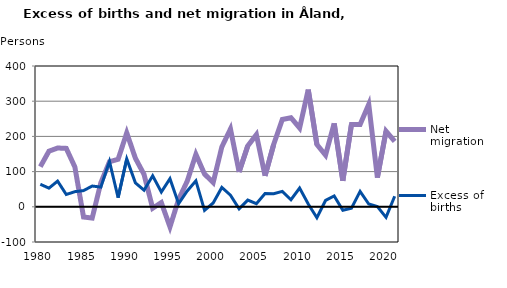
| Category | Net migration | Excess of births |
|---|---|---|
| 1980.0 | 114 | 64 |
| 1981.0 | 158 | 53 |
| 1982.0 | 167 | 73 |
| 1983.0 | 166 | 35 |
| 1984.0 | 113 | 43 |
| 1985.0 | -29 | 46 |
| 1986.0 | -32 | 59 |
| 1987.0 | 68 | 56 |
| 1988.0 | 128 | 129 |
| 1989.0 | 135 | 26 |
| 1990.0 | 210 | 136 |
| 1991.0 | 138 | 68 |
| 1992.0 | 92 | 47 |
| 1993.0 | -4 | 88 |
| 1994.0 | 12 | 42 |
| 1995.0 | -57 | 80 |
| 1996.0 | 21 | 9 |
| 1997.0 | 73 | 45 |
| 1998.0 | 149 | 74 |
| 1999.0 | 93 | -10 |
| 2000.0 | 69 | 11 |
| 2001.0 | 170 | 55 |
| 2002.0 | 221 | 33 |
| 2003.0 | 99 | -6 |
| 2004.0 | 173 | 19 |
| 2005.0 | 205 | 9 |
| 2006.0 | 88 | 38 |
| 2007.0 | 177 | 37 |
| 2008.0 | 248 | 44 |
| 2009.0 | 253 | 20 |
| 2010.0 | 224 | 53 |
| 2011.0 | 333 | 8 |
| 2012.0 | 177 | -31 |
| 2013.0 | 147 | 18 |
| 2014.0 | 237 | 31 |
| 2015.0 | 74 | -10 |
| 2016.0 | 234 | -4 |
| 2017.0 | 234 | 44 |
| 2018.0 | 291 | 8 |
| 2019.0 | 83 | 1 |
| 2020.0 | 215 | -30 |
| 2021.0 | 186 | 30 |